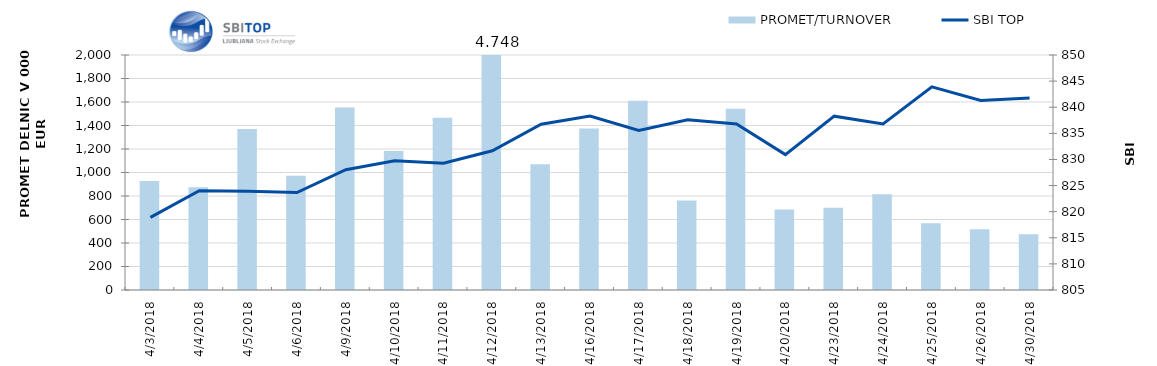
| Category | PROMET/TURNOVER |
|---|---|
| 4/3/18 | 928 |
| 4/4/18 | 874 |
| 4/5/18 | 1370 |
| 4/6/18 | 973 |
| 4/9/18 | 1554 |
| 4/10/18 | 1183 |
| 4/11/18 | 1467 |
| 4/12/18 | 4748 |
| 4/13/18 | 1070 |
| 4/16/18 | 1374 |
| 4/17/18 | 1610 |
| 4/18/18 | 762 |
| 4/19/18 | 1542 |
| 4/20/18 | 686 |
| 4/23/18 | 699 |
| 4/24/18 | 815 |
| 4/25/18 | 569 |
| 4/26/18 | 517 |
| 4/30/18 | 475 |